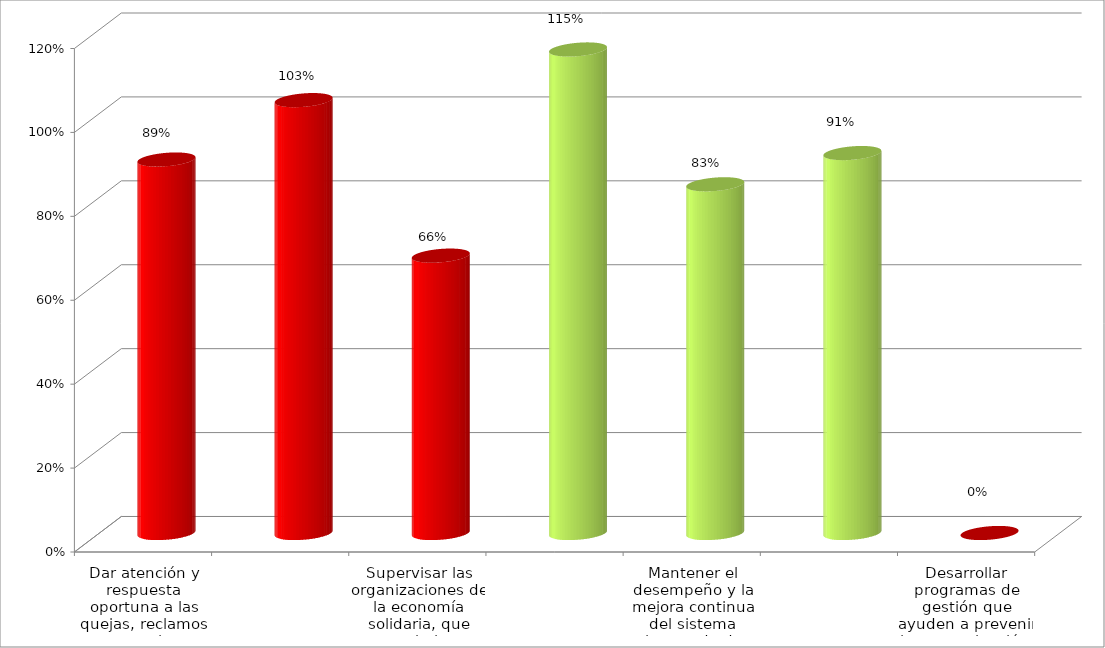
| Category | Series 0 |
|---|---|
| Dar atención y respuesta oportuna a las quejas, reclamos y consultas, formuladas por la ciudadania. | 0.89 |
| Formular, desarrollar y ejecutar, oportunamente, los proyectos de inversión de la entidad. | 1.032 |
| Supervisar las organizaciones de la economía solidaria, que estan bajo su competencia. | 0.661 |
| Mejorar los canales internos y externos de comunicación de la entidad. | 1.152 |
| Mantener el desempeño y la mejora continua del sistema integrado de gestión  | 0.831 |
| Mejorar la calidad del servicio y el medio ambiente fortaleciendo el Talento Humano. | 0.906 |
| Desarrollar programas de gestión que ayuden a prevenir la contaminación, a reducir y controlar los aspectos e impactos ambientales identificados | 0 |